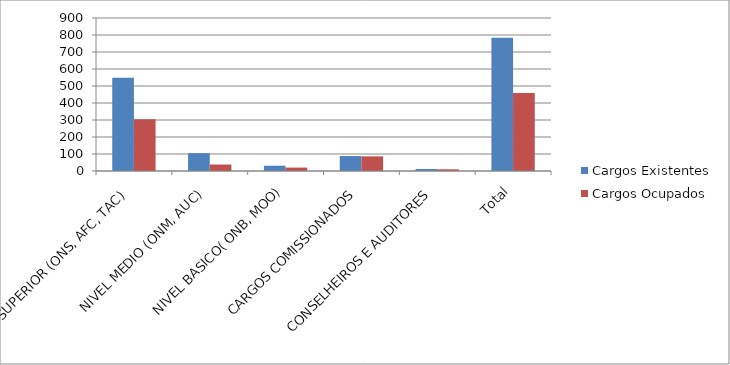
| Category | Cargos Existentes | Cargos Ocupados |
|---|---|---|
| NIVEL SUPERIOR (ONS, AFC, TAC) | 548 | 305 |
| NIVEL MEDIO (ONM, AUC) | 105 | 38 |
| NIVEL BASICO( ONB, MOO) | 31 | 20 |
| CARGOS COMISSIONADOS | 88 | 86 |
| CONSELHEIROS E AUDITORES | 12 | 10 |
| Total | 784 | 459 |